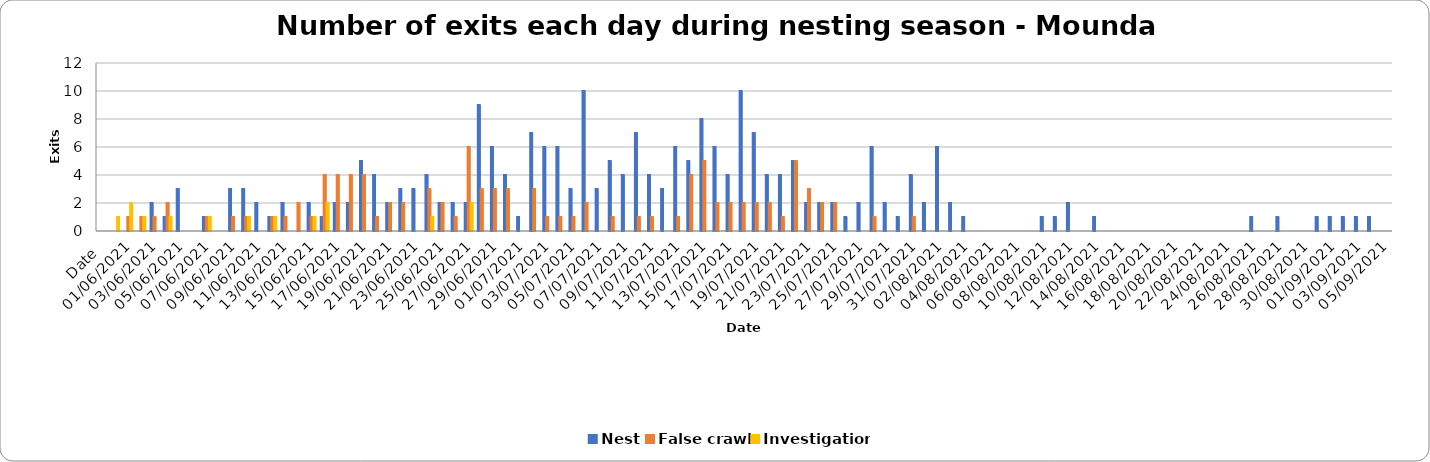
| Category | Nest | False crawl | Investigation |
|---|---|---|---|
| Date | 0 | 0 | 0 |
| 31/05/2021 | 0 | 0 | 1 |
| 01/06/2021 | 0 | 1 | 2 |
| 02/06/2021 | 0 | 1 | 1 |
| 03/06/2021 | 2 | 1 | 0 |
| 04/06/2021 | 1 | 2 | 1 |
| 05/06/2021 | 3 | 0 | 0 |
| 06/06/2021 | 0 | 0 | 0 |
| 07/06/2021 | 1 | 1 | 1 |
| 08/06/2021 | 0 | 0 | 0 |
| 09/06/2021 | 3 | 1 | 0 |
| 10/06/2021 | 3 | 1 | 1 |
| 11/06/2021 | 2 | 0 | 0 |
| 12/06/2021 | 1 | 1 | 1 |
| 13/06/2021 | 2 | 1 | 0 |
| 14/06/2021 | 0 | 2 | 0 |
| 15/06/2021 | 2 | 1 | 1 |
| 16/06/2021 | 1 | 4 | 2 |
| 17/06/2021 | 2 | 4 | 0 |
| 18/06/2021 | 2 | 4 | 0 |
| 19/06/2021 | 5 | 4 | 0 |
| 20/06/2021 | 4 | 1 | 0 |
| 21/06/2021 | 2 | 2 | 0 |
| 22/06/2021 | 3 | 2 | 0 |
| 23/06/2021 | 3 | 0 | 0 |
| 24/06/2021 | 4 | 3 | 1 |
| 25/06/2021 | 2 | 2 | 0 |
| 26/06/2021 | 2 | 1 | 0 |
| 27/06/2021 | 2 | 6 | 2 |
| 28/06/2021 | 9 | 3 | 0 |
| 29/06/2021 | 6 | 3 | 0 |
| 30/06/2021 | 4 | 3 | 0 |
| 01/07/2021 | 1 | 0 | 0 |
| 02/07/2021 | 7 | 3 | 0 |
| 03/07/2021 | 6 | 1 | 0 |
| 04/07/2021 | 6 | 1 | 0 |
| 05/07/2021 | 3 | 1 | 0 |
| 06/07/2021 | 10 | 2 | 0 |
| 07/07/2021 | 3 | 0 | 0 |
| 08/07/2021 | 5 | 1 | 0 |
| 09/07/2021 | 4 | 0 | 0 |
| 10/07/2021 | 7 | 1 | 0 |
| 11/07/2021 | 4 | 1 | 0 |
| 12/07/2021 | 3 | 0 | 0 |
| 13/07/2021 | 6 | 1 | 0 |
| 14/07/2021 | 5 | 4 | 0 |
| 15/07/2021 | 8 | 5 | 0 |
| 16/07/2021 | 6 | 2 | 0 |
| 17/07/2021 | 4 | 2 | 0 |
| 18/07/2021 | 10 | 2 | 0 |
| 19/07/2021 | 7 | 2 | 0 |
| 20/07/2021 | 4 | 2 | 0 |
| 21/07/2021 | 4 | 1 | 0 |
| 22/07/2021 | 5 | 5 | 0 |
| 23/07/2021 | 2 | 3 | 0 |
| 24/07/2021 | 2 | 2 | 0 |
| 25/07/2021 | 2 | 2 | 0 |
| 26/07/2021 | 1 | 0 | 0 |
| 27/07/2021 | 2 | 0 | 0 |
| 28/07/2021 | 6 | 1 | 0 |
| 29/07/2021 | 2 | 0 | 0 |
| 30/07/2021 | 1 | 0 | 0 |
| 31/07/2021 | 4 | 1 | 0 |
| 01/08/2021 | 2 | 0 | 0 |
| 02/08/2021 | 6 | 0 | 0 |
| 03/08/2021 | 2 | 0 | 0 |
| 04/08/2021 | 1 | 0 | 0 |
| 05/08/2021 | 0 | 0 | 0 |
| 06/08/2021 | 0 | 0 | 0 |
| 07/08/2021 | 0 | 0 | 0 |
| 08/08/2021 | 0 | 0 | 0 |
| 09/08/2021 | 0 | 0 | 0 |
| 10/08/2021 | 1 | 0 | 0 |
| 11/08/2021 | 1 | 0 | 0 |
| 12/08/2021 | 2 | 0 | 0 |
| 13/08/2021 | 0 | 0 | 0 |
| 14/08/2021 | 1 | 0 | 0 |
| 15/08/2021 | 0 | 0 | 0 |
| 16/08/2021 | 0 | 0 | 0 |
| 17/08/2021 | 0 | 0 | 0 |
| 18/08/2021 | 0 | 0 | 0 |
| 19/08/2021 | 0 | 0 | 0 |
| 20/08/2021 | 0 | 0 | 0 |
| 21/08/2021 | 0 | 0 | 0 |
| 22/08/2021 | 0 | 0 | 0 |
| 23/08/2021 | 0 | 0 | 0 |
| 24/08/2021 | 0 | 0 | 0 |
| 25/08/2021 | 0 | 0 | 0 |
| 26/08/2021 | 1 | 0 | 0 |
| 27/08/2021 | 0 | 0 | 0 |
| 28/08/2021 | 1 | 0 | 0 |
| 29/08/2021 | 0 | 0 | 0 |
| 30/08/2021 | 0 | 0 | 0 |
| 31/08/2021 | 1 | 0 | 0 |
| 01/09/2021 | 1 | 0 | 0 |
| 02/09/2021 | 1 | 0 | 0 |
| 03/09/2021 | 1 | 0 | 0 |
| 04/09/2021 | 1 | 0 | 0 |
| 05/09/2021 | 0 | 0 | 0 |